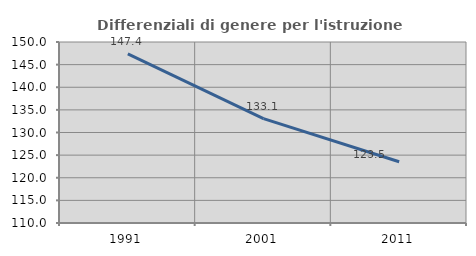
| Category | Differenziali di genere per l'istruzione superiore |
|---|---|
| 1991.0 | 147.367 |
| 2001.0 | 133.062 |
| 2011.0 | 123.547 |